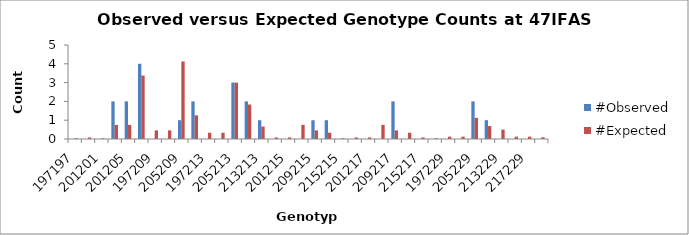
| Category | #Observed | #Expected |
|---|---|---|
| 197197.0 | 0 | 0.042 |
| 197201.0 | 0 | 0.083 |
| 201201.0 | 0 | 0.042 |
| 197205.0 | 2 | 0.75 |
| 201205.0 | 2 | 0.75 |
| 205205.0 | 4 | 3.375 |
| 197209.0 | 0 | 0.458 |
| 201209.0 | 0 | 0.458 |
| 205209.0 | 1 | 4.125 |
| 209209.0 | 2 | 1.26 |
| 197213.0 | 0 | 0.333 |
| 201213.0 | 0 | 0.333 |
| 205213.0 | 3 | 3 |
| 209213.0 | 2 | 1.833 |
| 213213.0 | 1 | 0.667 |
| 197215.0 | 0 | 0.083 |
| 201215.0 | 0 | 0.083 |
| 205215.0 | 0 | 0.75 |
| 209215.0 | 1 | 0.458 |
| 213215.0 | 1 | 0.333 |
| 215215.0 | 0 | 0.042 |
| 197217.0 | 0 | 0.083 |
| 201217.0 | 0 | 0.083 |
| 205217.0 | 0 | 0.75 |
| 209217.0 | 2 | 0.458 |
| 213217.0 | 0 | 0.333 |
| 215217.0 | 0 | 0.083 |
| 217217.0 | 0 | 0.042 |
| 197229.0 | 0 | 0.125 |
| 201229.0 | 0 | 0.125 |
| 205229.0 | 2 | 1.125 |
| 209229.0 | 1 | 0.688 |
| 213229.0 | 0 | 0.5 |
| 215229.0 | 0 | 0.125 |
| 217229.0 | 0 | 0.125 |
| 229229.0 | 0 | 0.094 |